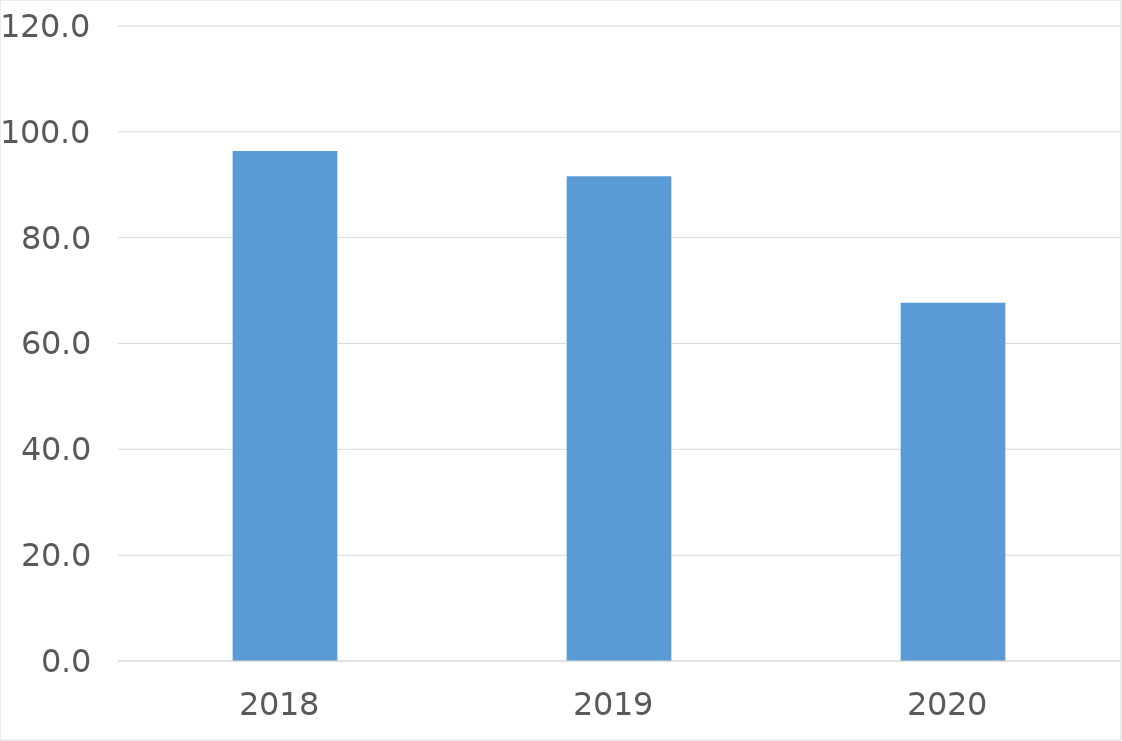
| Category | Series 0 |
|---|---|
| 2018 | 96.4 |
| 2019 | 91.6 |
| 2020 | 67.7 |